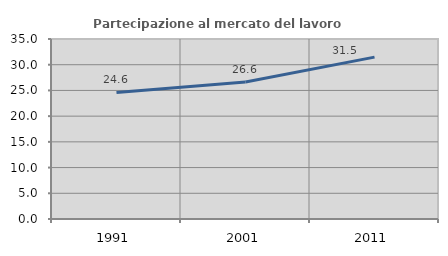
| Category | Partecipazione al mercato del lavoro  femminile |
|---|---|
| 1991.0 | 24.61 |
| 2001.0 | 26.645 |
| 2011.0 | 31.472 |